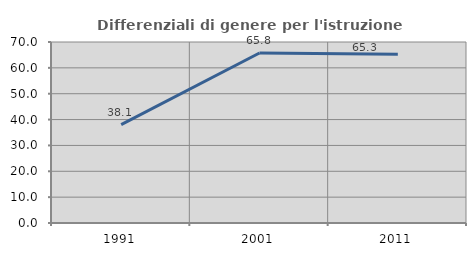
| Category | Differenziali di genere per l'istruzione superiore |
|---|---|
| 1991.0 | 38.065 |
| 2001.0 | 65.753 |
| 2011.0 | 65.297 |